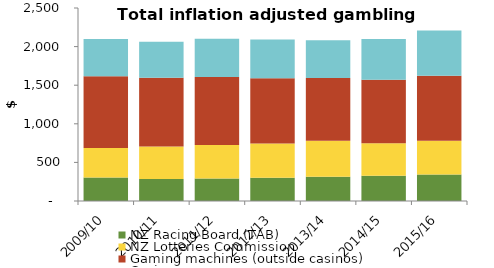
| Category | NZ Racing Board (TAB) | NZ Lotteries Commission | Gaming machines (outside casinos) | Casinos |
|---|---|---|---|---|
| 2009/10 | 305.244 | 380.054 | 931.065 | 482.214 |
| 2010/11 | 284.11 | 421.257 | 891.616 | 466.936 |
| 2011/12 | 291.914 | 432.004 | 881.006 | 497.952 |
| 2012/13 | 301.542 | 442.473 | 847.167 | 501.646 |
| 2013/14 | 312.767 | 466.935 | 813.018 | 489.719 |
| 2014/15 | 326.405 | 422.129 | 821.522 | 529.3 |
| 2015/16 | 342.291 | 437.262 | 843.482 | 585.622 |